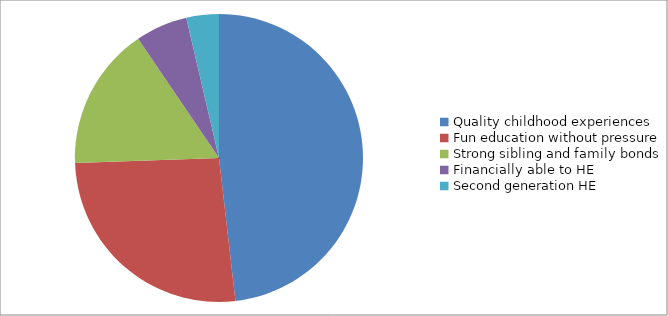
| Category | Series 0 |
|---|---|
| Quality childhood experiences | 66 |
| Fun education without pressure | 36 |
| Strong sibling and family bonds | 22 |
| Financially able to HE | 8 |
| Second generation HE | 5 |